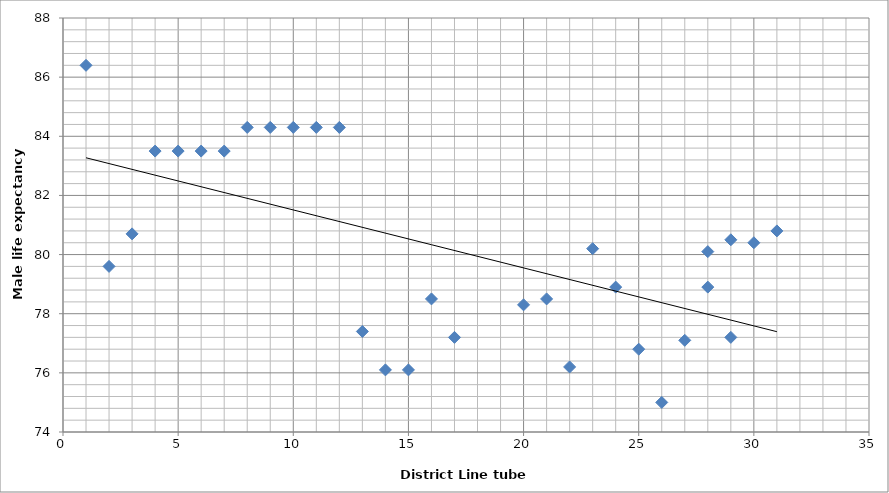
| Category | Series 0 |
|---|---|
| 31.0 | 80.8 |
| 30.0 | 80.4 |
| 29.0 | 80.5 |
| 28.0 | 78.9 |
| 27.0 | 77.1 |
| 26.0 | 75 |
| 25.0 | 76.8 |
| 24.0 | 78.9 |
| 23.0 | 80.2 |
| 22.0 | 76.2 |
| 21.0 | 78.5 |
| 20.0 | 78.3 |
| 29.0 | 77.2 |
| 28.0 | 80.1 |
| 17.0 | 77.2 |
| 16.0 | 78.5 |
| 15.0 | 76.1 |
| 14.0 | 76.1 |
| 13.0 | 77.4 |
| 12.0 | 84.3 |
| 11.0 | 84.3 |
| 10.0 | 84.3 |
| 9.0 | 84.3 |
| 8.0 | 84.3 |
| 7.0 | 83.5 |
| 6.0 | 83.5 |
| 5.0 | 83.5 |
| 4.0 | 83.5 |
| 3.0 | 80.7 |
| 2.0 | 79.6 |
| 1.0 | 86.4 |